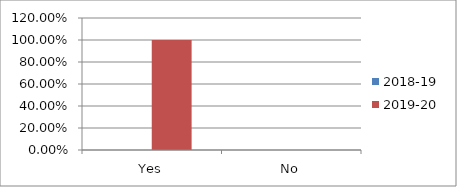
| Category | 2018-19 | 2019-20 |
|---|---|---|
| Yes | 0 | 1 |
| No | 0 | 0 |